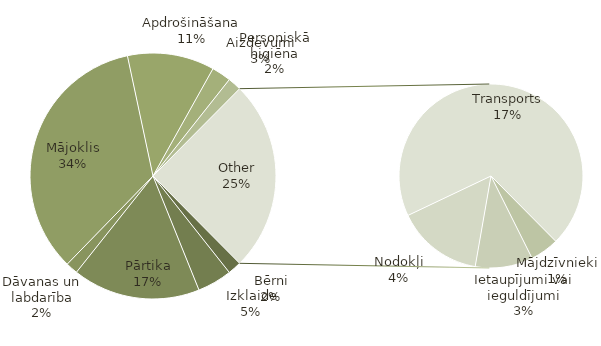
| Category | Total |
|---|---|
| Bērni | 140 |
| Izklaide | 358 |
| Pārtika | 1320 |
| Dāvanas un labdarība | 125 |
| Mājoklis | 2702 |
| Apdrošināšana | 900 |
| Aizdevumi | 200 |
| Personiskā higiēna | 140 |
| Mājdzīvnieki | 100 |
| Ietaupījumi vai ieguldījumi | 200 |
| Nodokļi | 300 |
| Transports | 1375 |